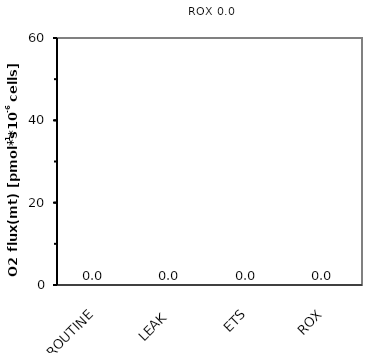
| Category | ROX 0,0 |
|---|---|
| ROUTINE | 0 |
| LEAK | 0 |
| ETS | 0 |
| ROX | 0 |